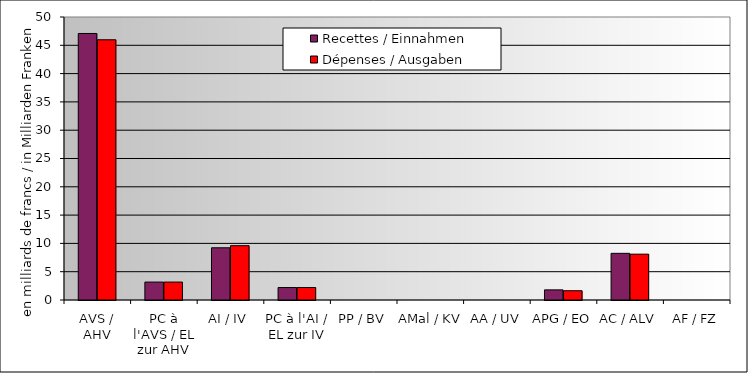
| Category | Recettes / Einnahmen | Dépenses / Ausgaben |
|---|---|---|
| AVS / AHV | 47.088 | 45.977 |
| PC à l'AVS / EL zur AHV | 3.168 | 3.168 |
| AI / IV | 9.224 | 9.594 |
| PC à l'AI / EL zur IV | 2.201 | 2.201 |
| PP / BV | 0 | 0 |
| AMal / KV | 0 | 0 |
| AA / UV | 0 | 0 |
| APG / EO | 1.79 | 1.637 |
| AC / ALV | 8.243 | 8.099 |
| AF / FZ | 0 | 0 |